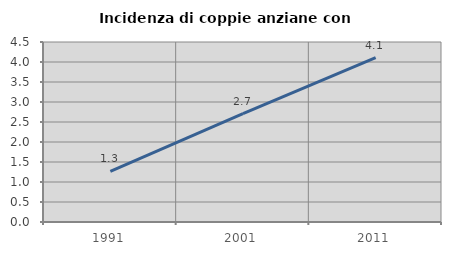
| Category | Incidenza di coppie anziane con figli |
|---|---|
| 1991.0 | 1.266 |
| 2001.0 | 2.709 |
| 2011.0 | 4.107 |